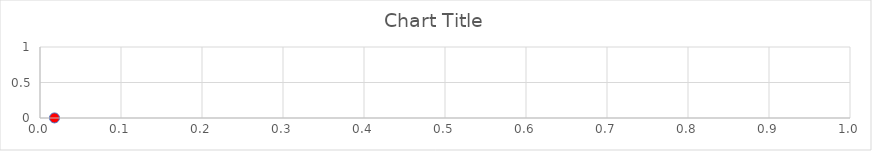
| Category | Series 0 |
|---|---|
| 0.01789545986320018 | 0.001 |